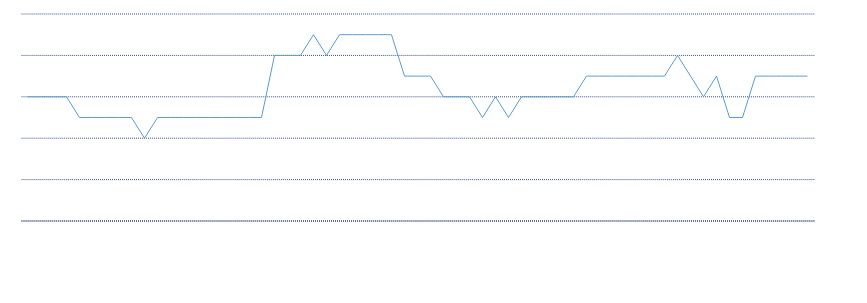
| Category | Series 0 |
|---|---|
| 2018-03-08 15:30:00 | 2739.25 |
| 2018-03-08 15:14:59 | 2739.25 |
| 2018-03-08 15:14:58 | 2739.25 |
| 2018-03-08 15:14:57 | 2739.25 |
| 2018-03-08 15:14:56 | 2739.25 |
| 2018-03-08 15:14:55 | 2738.75 |
| 2018-03-08 15:14:54 | 2738.75 |
| 2018-03-08 15:14:53 | 2739.25 |
| 2018-03-08 15:14:52 | 2739 |
| 2018-03-08 15:14:51 | 2739.25 |
| 2018-03-08 15:14:50 | 2739.5 |
| 2018-03-08 15:14:49 | 2739.25 |
| 2018-03-08 15:14:48 | 2739.25 |
| 2018-03-08 15:14:47 | 2739.25 |
| 2018-03-08 15:14:46 | 2739.25 |
| 2018-03-08 15:14:45 | 2739.25 |
| 2018-03-08 15:14:44 | 2739.25 |
| 2018-03-08 15:14:43 | 2739.25 |
| 2018-03-08 15:14:42 | 2739 |
| 2018-03-08 15:14:41 | 2739 |
| 2018-03-08 15:14:40 | 2739 |
| 2018-03-08 15:14:39 | 2739 |
| 2018-03-08 15:14:38 | 2739 |
| 2018-03-08 15:14:37 | 2738.75 |
| 2018-03-08 15:14:36 | 2739 |
| 2018-03-08 15:14:35 | 2738.75 |
| 2018-03-08 15:14:34 | 2739 |
| 2018-03-08 15:14:33 | 2739 |
| 2018-03-08 15:14:32 | 2739 |
| 2018-03-08 15:14:31 | 2739.25 |
| 2018-03-08 15:14:30 | 2739.25 |
| 2018-03-08 15:14:29 | 2739.25 |
| 2018-03-08 15:14:28 | 2739.75 |
| 2018-03-08 15:14:27 | 2739.75 |
| 2018-03-08 15:14:26 | 2739.75 |
| 2018-03-08 15:14:25 | 2739.75 |
| 2018-03-08 15:14:24 | 2739.75 |
| 2018-03-08 15:14:23 | 2739.5 |
| 2018-03-08 15:14:22 | 2739.75 |
| 2018-03-08 15:14:21 | 2739.5 |
| 2018-03-08 15:14:20 | 2739.5 |
| 2018-03-08 15:14:19 | 2739.5 |
| 2018-03-08 15:14:18 | 2738.75 |
| 2018-03-08 15:14:17 | 2738.75 |
| 2018-03-08 15:14:16 | 2738.75 |
| 2018-03-08 15:14:15 | 2738.75 |
| 2018-03-08 15:14:14 | 2738.75 |
| 2018-03-08 15:14:13 | 2738.75 |
| 2018-03-08 15:14:12 | 2738.75 |
| 2018-03-08 15:14:11 | 2738.75 |
| 2018-03-08 15:14:10 | 2738.75 |
| 2018-03-08 15:14:09 | 2738.5 |
| 2018-03-08 15:14:08 | 2738.75 |
| 2018-03-08 15:14:07 | 2738.75 |
| 2018-03-08 15:14:06 | 2738.75 |
| 2018-03-08 15:14:05 | 2738.75 |
| 2018-03-08 15:14:04 | 2738.75 |
| 2018-03-08 15:14:03 | 2739 |
| 2018-03-08 15:14:02 | 2739 |
| 2018-03-08 15:14:01 | 2739 |
| 2018-03-08 15:14:00 | 2739 |